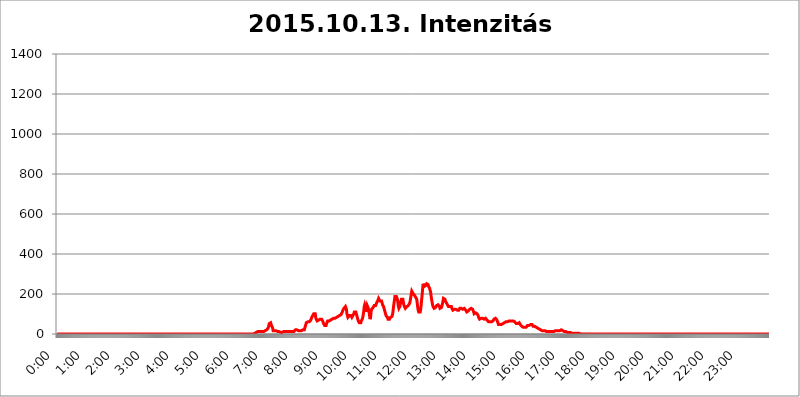
| Category | 2015.10.13. Intenzitás [W/m^2] |
|---|---|
| 0.0 | 0 |
| 0.0006944444444444445 | 0 |
| 0.001388888888888889 | 0 |
| 0.0020833333333333333 | 0 |
| 0.002777777777777778 | 0 |
| 0.003472222222222222 | 0 |
| 0.004166666666666667 | 0 |
| 0.004861111111111111 | 0 |
| 0.005555555555555556 | 0 |
| 0.0062499999999999995 | 0 |
| 0.006944444444444444 | 0 |
| 0.007638888888888889 | 0 |
| 0.008333333333333333 | 0 |
| 0.009027777777777779 | 0 |
| 0.009722222222222222 | 0 |
| 0.010416666666666666 | 0 |
| 0.011111111111111112 | 0 |
| 0.011805555555555555 | 0 |
| 0.012499999999999999 | 0 |
| 0.013194444444444444 | 0 |
| 0.013888888888888888 | 0 |
| 0.014583333333333332 | 0 |
| 0.015277777777777777 | 0 |
| 0.015972222222222224 | 0 |
| 0.016666666666666666 | 0 |
| 0.017361111111111112 | 0 |
| 0.018055555555555557 | 0 |
| 0.01875 | 0 |
| 0.019444444444444445 | 0 |
| 0.02013888888888889 | 0 |
| 0.020833333333333332 | 0 |
| 0.02152777777777778 | 0 |
| 0.022222222222222223 | 0 |
| 0.02291666666666667 | 0 |
| 0.02361111111111111 | 0 |
| 0.024305555555555556 | 0 |
| 0.024999999999999998 | 0 |
| 0.025694444444444447 | 0 |
| 0.02638888888888889 | 0 |
| 0.027083333333333334 | 0 |
| 0.027777777777777776 | 0 |
| 0.02847222222222222 | 0 |
| 0.029166666666666664 | 0 |
| 0.029861111111111113 | 0 |
| 0.030555555555555555 | 0 |
| 0.03125 | 0 |
| 0.03194444444444445 | 0 |
| 0.03263888888888889 | 0 |
| 0.03333333333333333 | 0 |
| 0.034027777777777775 | 0 |
| 0.034722222222222224 | 0 |
| 0.035416666666666666 | 0 |
| 0.036111111111111115 | 0 |
| 0.03680555555555556 | 0 |
| 0.0375 | 0 |
| 0.03819444444444444 | 0 |
| 0.03888888888888889 | 0 |
| 0.03958333333333333 | 0 |
| 0.04027777777777778 | 0 |
| 0.04097222222222222 | 0 |
| 0.041666666666666664 | 0 |
| 0.042361111111111106 | 0 |
| 0.04305555555555556 | 0 |
| 0.043750000000000004 | 0 |
| 0.044444444444444446 | 0 |
| 0.04513888888888889 | 0 |
| 0.04583333333333334 | 0 |
| 0.04652777777777778 | 0 |
| 0.04722222222222222 | 0 |
| 0.04791666666666666 | 0 |
| 0.04861111111111111 | 0 |
| 0.049305555555555554 | 0 |
| 0.049999999999999996 | 0 |
| 0.05069444444444445 | 0 |
| 0.051388888888888894 | 0 |
| 0.052083333333333336 | 0 |
| 0.05277777777777778 | 0 |
| 0.05347222222222222 | 0 |
| 0.05416666666666667 | 0 |
| 0.05486111111111111 | 0 |
| 0.05555555555555555 | 0 |
| 0.05625 | 0 |
| 0.05694444444444444 | 0 |
| 0.057638888888888885 | 0 |
| 0.05833333333333333 | 0 |
| 0.05902777777777778 | 0 |
| 0.059722222222222225 | 0 |
| 0.06041666666666667 | 0 |
| 0.061111111111111116 | 0 |
| 0.06180555555555556 | 0 |
| 0.0625 | 0 |
| 0.06319444444444444 | 0 |
| 0.06388888888888888 | 0 |
| 0.06458333333333334 | 0 |
| 0.06527777777777778 | 0 |
| 0.06597222222222222 | 0 |
| 0.06666666666666667 | 0 |
| 0.06736111111111111 | 0 |
| 0.06805555555555555 | 0 |
| 0.06874999999999999 | 0 |
| 0.06944444444444443 | 0 |
| 0.07013888888888889 | 0 |
| 0.07083333333333333 | 0 |
| 0.07152777777777779 | 0 |
| 0.07222222222222223 | 0 |
| 0.07291666666666667 | 0 |
| 0.07361111111111111 | 0 |
| 0.07430555555555556 | 0 |
| 0.075 | 0 |
| 0.07569444444444444 | 0 |
| 0.0763888888888889 | 0 |
| 0.07708333333333334 | 0 |
| 0.07777777777777778 | 0 |
| 0.07847222222222222 | 0 |
| 0.07916666666666666 | 0 |
| 0.0798611111111111 | 0 |
| 0.08055555555555556 | 0 |
| 0.08125 | 0 |
| 0.08194444444444444 | 0 |
| 0.08263888888888889 | 0 |
| 0.08333333333333333 | 0 |
| 0.08402777777777777 | 0 |
| 0.08472222222222221 | 0 |
| 0.08541666666666665 | 0 |
| 0.08611111111111112 | 0 |
| 0.08680555555555557 | 0 |
| 0.08750000000000001 | 0 |
| 0.08819444444444445 | 0 |
| 0.08888888888888889 | 0 |
| 0.08958333333333333 | 0 |
| 0.09027777777777778 | 0 |
| 0.09097222222222222 | 0 |
| 0.09166666666666667 | 0 |
| 0.09236111111111112 | 0 |
| 0.09305555555555556 | 0 |
| 0.09375 | 0 |
| 0.09444444444444444 | 0 |
| 0.09513888888888888 | 0 |
| 0.09583333333333333 | 0 |
| 0.09652777777777777 | 0 |
| 0.09722222222222222 | 0 |
| 0.09791666666666667 | 0 |
| 0.09861111111111111 | 0 |
| 0.09930555555555555 | 0 |
| 0.09999999999999999 | 0 |
| 0.10069444444444443 | 0 |
| 0.1013888888888889 | 0 |
| 0.10208333333333335 | 0 |
| 0.10277777777777779 | 0 |
| 0.10347222222222223 | 0 |
| 0.10416666666666667 | 0 |
| 0.10486111111111111 | 0 |
| 0.10555555555555556 | 0 |
| 0.10625 | 0 |
| 0.10694444444444444 | 0 |
| 0.1076388888888889 | 0 |
| 0.10833333333333334 | 0 |
| 0.10902777777777778 | 0 |
| 0.10972222222222222 | 0 |
| 0.1111111111111111 | 0 |
| 0.11180555555555556 | 0 |
| 0.11180555555555556 | 0 |
| 0.1125 | 0 |
| 0.11319444444444444 | 0 |
| 0.11388888888888889 | 0 |
| 0.11458333333333333 | 0 |
| 0.11527777777777777 | 0 |
| 0.11597222222222221 | 0 |
| 0.11666666666666665 | 0 |
| 0.1173611111111111 | 0 |
| 0.11805555555555557 | 0 |
| 0.11944444444444445 | 0 |
| 0.12013888888888889 | 0 |
| 0.12083333333333333 | 0 |
| 0.12152777777777778 | 0 |
| 0.12222222222222223 | 0 |
| 0.12291666666666667 | 0 |
| 0.12291666666666667 | 0 |
| 0.12361111111111112 | 0 |
| 0.12430555555555556 | 0 |
| 0.125 | 0 |
| 0.12569444444444444 | 0 |
| 0.12638888888888888 | 0 |
| 0.12708333333333333 | 0 |
| 0.16875 | 0 |
| 0.12847222222222224 | 0 |
| 0.12916666666666668 | 0 |
| 0.12986111111111112 | 0 |
| 0.13055555555555556 | 0 |
| 0.13125 | 0 |
| 0.13194444444444445 | 0 |
| 0.1326388888888889 | 0 |
| 0.13333333333333333 | 0 |
| 0.13402777777777777 | 0 |
| 0.13402777777777777 | 0 |
| 0.13472222222222222 | 0 |
| 0.13541666666666666 | 0 |
| 0.1361111111111111 | 0 |
| 0.13749999999999998 | 0 |
| 0.13819444444444443 | 0 |
| 0.1388888888888889 | 0 |
| 0.13958333333333334 | 0 |
| 0.14027777777777778 | 0 |
| 0.14097222222222222 | 0 |
| 0.14166666666666666 | 0 |
| 0.1423611111111111 | 0 |
| 0.14305555555555557 | 0 |
| 0.14375000000000002 | 0 |
| 0.14444444444444446 | 0 |
| 0.1451388888888889 | 0 |
| 0.1451388888888889 | 0 |
| 0.14652777777777778 | 0 |
| 0.14722222222222223 | 0 |
| 0.14791666666666667 | 0 |
| 0.1486111111111111 | 0 |
| 0.14930555555555555 | 0 |
| 0.15 | 0 |
| 0.15069444444444444 | 0 |
| 0.15138888888888888 | 0 |
| 0.15208333333333332 | 0 |
| 0.15277777777777776 | 0 |
| 0.15347222222222223 | 0 |
| 0.15416666666666667 | 0 |
| 0.15486111111111112 | 0 |
| 0.15555555555555556 | 0 |
| 0.15625 | 0 |
| 0.15694444444444444 | 0 |
| 0.15763888888888888 | 0 |
| 0.15833333333333333 | 0 |
| 0.15902777777777777 | 0 |
| 0.15972222222222224 | 0 |
| 0.16041666666666668 | 0 |
| 0.16111111111111112 | 0 |
| 0.16180555555555556 | 0 |
| 0.1625 | 0 |
| 0.16319444444444445 | 0 |
| 0.1638888888888889 | 0 |
| 0.16458333333333333 | 0 |
| 0.16527777777777777 | 0 |
| 0.16597222222222222 | 0 |
| 0.16666666666666666 | 0 |
| 0.1673611111111111 | 0 |
| 0.16805555555555554 | 0 |
| 0.16874999999999998 | 0 |
| 0.16944444444444443 | 0 |
| 0.17013888888888887 | 0 |
| 0.1708333333333333 | 0 |
| 0.17152777777777775 | 0 |
| 0.17222222222222225 | 0 |
| 0.1729166666666667 | 0 |
| 0.17361111111111113 | 0 |
| 0.17430555555555557 | 0 |
| 0.17500000000000002 | 0 |
| 0.17569444444444446 | 0 |
| 0.1763888888888889 | 0 |
| 0.17708333333333334 | 0 |
| 0.17777777777777778 | 0 |
| 0.17847222222222223 | 0 |
| 0.17916666666666667 | 0 |
| 0.1798611111111111 | 0 |
| 0.18055555555555555 | 0 |
| 0.18125 | 0 |
| 0.18194444444444444 | 0 |
| 0.1826388888888889 | 0 |
| 0.18333333333333335 | 0 |
| 0.1840277777777778 | 0 |
| 0.18472222222222223 | 0 |
| 0.18541666666666667 | 0 |
| 0.18611111111111112 | 0 |
| 0.18680555555555556 | 0 |
| 0.1875 | 0 |
| 0.18819444444444444 | 0 |
| 0.18888888888888888 | 0 |
| 0.18958333333333333 | 0 |
| 0.19027777777777777 | 0 |
| 0.1909722222222222 | 0 |
| 0.19166666666666665 | 0 |
| 0.19236111111111112 | 0 |
| 0.19305555555555554 | 0 |
| 0.19375 | 0 |
| 0.19444444444444445 | 0 |
| 0.1951388888888889 | 0 |
| 0.19583333333333333 | 0 |
| 0.19652777777777777 | 0 |
| 0.19722222222222222 | 0 |
| 0.19791666666666666 | 0 |
| 0.1986111111111111 | 0 |
| 0.19930555555555554 | 0 |
| 0.19999999999999998 | 0 |
| 0.20069444444444443 | 0 |
| 0.20138888888888887 | 0 |
| 0.2020833333333333 | 0 |
| 0.2027777777777778 | 0 |
| 0.2034722222222222 | 0 |
| 0.2041666666666667 | 0 |
| 0.20486111111111113 | 0 |
| 0.20555555555555557 | 0 |
| 0.20625000000000002 | 0 |
| 0.20694444444444446 | 0 |
| 0.2076388888888889 | 0 |
| 0.20833333333333334 | 0 |
| 0.20902777777777778 | 0 |
| 0.20972222222222223 | 0 |
| 0.21041666666666667 | 0 |
| 0.2111111111111111 | 0 |
| 0.21180555555555555 | 0 |
| 0.2125 | 0 |
| 0.21319444444444444 | 0 |
| 0.2138888888888889 | 0 |
| 0.21458333333333335 | 0 |
| 0.2152777777777778 | 0 |
| 0.21597222222222223 | 0 |
| 0.21666666666666667 | 0 |
| 0.21736111111111112 | 0 |
| 0.21805555555555556 | 0 |
| 0.21875 | 0 |
| 0.21944444444444444 | 0 |
| 0.22013888888888888 | 0 |
| 0.22083333333333333 | 0 |
| 0.22152777777777777 | 0 |
| 0.2222222222222222 | 0 |
| 0.22291666666666665 | 0 |
| 0.2236111111111111 | 0 |
| 0.22430555555555556 | 0 |
| 0.225 | 0 |
| 0.22569444444444445 | 0 |
| 0.2263888888888889 | 0 |
| 0.22708333333333333 | 0 |
| 0.22777777777777777 | 0 |
| 0.22847222222222222 | 0 |
| 0.22916666666666666 | 0 |
| 0.2298611111111111 | 0 |
| 0.23055555555555554 | 0 |
| 0.23124999999999998 | 0 |
| 0.23194444444444443 | 0 |
| 0.23263888888888887 | 0 |
| 0.2333333333333333 | 0 |
| 0.2340277777777778 | 0 |
| 0.2347222222222222 | 0 |
| 0.2354166666666667 | 0 |
| 0.23611111111111113 | 0 |
| 0.23680555555555557 | 0 |
| 0.23750000000000002 | 0 |
| 0.23819444444444446 | 0 |
| 0.2388888888888889 | 0 |
| 0.23958333333333334 | 0 |
| 0.24027777777777778 | 0 |
| 0.24097222222222223 | 0 |
| 0.24166666666666667 | 0 |
| 0.2423611111111111 | 0 |
| 0.24305555555555555 | 0 |
| 0.24375 | 0 |
| 0.24444444444444446 | 0 |
| 0.24513888888888888 | 0 |
| 0.24583333333333335 | 0 |
| 0.2465277777777778 | 0 |
| 0.24722222222222223 | 0 |
| 0.24791666666666667 | 0 |
| 0.24861111111111112 | 0 |
| 0.24930555555555556 | 0 |
| 0.25 | 0 |
| 0.25069444444444444 | 0 |
| 0.2513888888888889 | 0 |
| 0.2520833333333333 | 0 |
| 0.25277777777777777 | 0 |
| 0.2534722222222222 | 0 |
| 0.25416666666666665 | 0 |
| 0.2548611111111111 | 0 |
| 0.2555555555555556 | 0 |
| 0.25625000000000003 | 0 |
| 0.2569444444444445 | 0 |
| 0.2576388888888889 | 0 |
| 0.25833333333333336 | 0 |
| 0.2590277777777778 | 0 |
| 0.25972222222222224 | 0 |
| 0.2604166666666667 | 0 |
| 0.2611111111111111 | 0 |
| 0.26180555555555557 | 0 |
| 0.2625 | 0 |
| 0.26319444444444445 | 0 |
| 0.2638888888888889 | 0 |
| 0.26458333333333334 | 0 |
| 0.2652777777777778 | 0 |
| 0.2659722222222222 | 0 |
| 0.26666666666666666 | 0 |
| 0.2673611111111111 | 0 |
| 0.26805555555555555 | 0 |
| 0.26875 | 0 |
| 0.26944444444444443 | 0 |
| 0.2701388888888889 | 0 |
| 0.2708333333333333 | 0 |
| 0.27152777777777776 | 0 |
| 0.2722222222222222 | 0 |
| 0.27291666666666664 | 0 |
| 0.2736111111111111 | 0 |
| 0.2743055555555555 | 0 |
| 0.27499999999999997 | 0 |
| 0.27569444444444446 | 0 |
| 0.27638888888888885 | 3.525 |
| 0.27708333333333335 | 3.525 |
| 0.2777777777777778 | 3.525 |
| 0.27847222222222223 | 7.887 |
| 0.2791666666666667 | 7.887 |
| 0.2798611111111111 | 7.887 |
| 0.28055555555555556 | 7.887 |
| 0.28125 | 12.257 |
| 0.28194444444444444 | 12.257 |
| 0.2826388888888889 | 12.257 |
| 0.2833333333333333 | 12.257 |
| 0.28402777777777777 | 12.257 |
| 0.2847222222222222 | 12.257 |
| 0.28541666666666665 | 12.257 |
| 0.28611111111111115 | 12.257 |
| 0.28680555555555554 | 12.257 |
| 0.28750000000000003 | 12.257 |
| 0.2881944444444445 | 12.257 |
| 0.2888888888888889 | 12.257 |
| 0.28958333333333336 | 12.257 |
| 0.2902777777777778 | 16.636 |
| 0.29097222222222224 | 16.636 |
| 0.2916666666666667 | 16.636 |
| 0.2923611111111111 | 21.024 |
| 0.29305555555555557 | 21.024 |
| 0.29375 | 21.024 |
| 0.29444444444444445 | 25.419 |
| 0.2951388888888889 | 25.419 |
| 0.29583333333333334 | 29.823 |
| 0.2965277777777778 | 38.653 |
| 0.2972222222222222 | 51.951 |
| 0.29791666666666666 | 56.398 |
| 0.2986111111111111 | 56.398 |
| 0.29930555555555555 | 56.398 |
| 0.3 | 47.511 |
| 0.30069444444444443 | 47.511 |
| 0.3013888888888889 | 47.511 |
| 0.3020833333333333 | 29.823 |
| 0.30277777777777776 | 16.636 |
| 0.3034722222222222 | 21.024 |
| 0.30416666666666664 | 16.636 |
| 0.3048611111111111 | 16.636 |
| 0.3055555555555555 | 12.257 |
| 0.30624999999999997 | 12.257 |
| 0.3069444444444444 | 16.636 |
| 0.3076388888888889 | 16.636 |
| 0.30833333333333335 | 16.636 |
| 0.3090277777777778 | 12.257 |
| 0.30972222222222223 | 12.257 |
| 0.3104166666666667 | 12.257 |
| 0.3111111111111111 | 12.257 |
| 0.31180555555555556 | 7.887 |
| 0.3125 | 12.257 |
| 0.31319444444444444 | 7.887 |
| 0.3138888888888889 | 7.887 |
| 0.3145833333333333 | 7.887 |
| 0.31527777777777777 | 7.887 |
| 0.3159722222222222 | 7.887 |
| 0.31666666666666665 | 7.887 |
| 0.31736111111111115 | 12.257 |
| 0.31805555555555554 | 12.257 |
| 0.31875000000000003 | 12.257 |
| 0.3194444444444445 | 12.257 |
| 0.3201388888888889 | 12.257 |
| 0.32083333333333336 | 12.257 |
| 0.3215277777777778 | 12.257 |
| 0.32222222222222224 | 12.257 |
| 0.3229166666666667 | 12.257 |
| 0.3236111111111111 | 12.257 |
| 0.32430555555555557 | 12.257 |
| 0.325 | 12.257 |
| 0.32569444444444445 | 12.257 |
| 0.3263888888888889 | 12.257 |
| 0.32708333333333334 | 12.257 |
| 0.3277777777777778 | 12.257 |
| 0.3284722222222222 | 12.257 |
| 0.32916666666666666 | 12.257 |
| 0.3298611111111111 | 12.257 |
| 0.33055555555555555 | 12.257 |
| 0.33125 | 12.257 |
| 0.33194444444444443 | 12.257 |
| 0.3326388888888889 | 12.257 |
| 0.3333333333333333 | 16.636 |
| 0.3340277777777778 | 21.024 |
| 0.3347222222222222 | 16.636 |
| 0.3354166666666667 | 21.024 |
| 0.3361111111111111 | 21.024 |
| 0.3368055555555556 | 21.024 |
| 0.33749999999999997 | 21.024 |
| 0.33819444444444446 | 16.636 |
| 0.33888888888888885 | 16.636 |
| 0.33958333333333335 | 16.636 |
| 0.34027777777777773 | 16.636 |
| 0.34097222222222223 | 16.636 |
| 0.3416666666666666 | 16.636 |
| 0.3423611111111111 | 16.636 |
| 0.3430555555555555 | 16.636 |
| 0.34375 | 21.024 |
| 0.3444444444444445 | 21.024 |
| 0.3451388888888889 | 21.024 |
| 0.3458333333333334 | 21.024 |
| 0.34652777777777777 | 21.024 |
| 0.34722222222222227 | 25.419 |
| 0.34791666666666665 | 38.653 |
| 0.34861111111111115 | 47.511 |
| 0.34930555555555554 | 56.398 |
| 0.35000000000000003 | 60.85 |
| 0.3506944444444444 | 60.85 |
| 0.3513888888888889 | 60.85 |
| 0.3520833333333333 | 65.31 |
| 0.3527777777777778 | 65.31 |
| 0.3534722222222222 | 60.85 |
| 0.3541666666666667 | 65.31 |
| 0.3548611111111111 | 65.31 |
| 0.35555555555555557 | 69.775 |
| 0.35625 | 74.246 |
| 0.35694444444444445 | 83.205 |
| 0.3576388888888889 | 87.692 |
| 0.35833333333333334 | 92.184 |
| 0.3590277777777778 | 96.682 |
| 0.3597222222222222 | 101.184 |
| 0.36041666666666666 | 105.69 |
| 0.3611111111111111 | 105.69 |
| 0.36180555555555555 | 101.184 |
| 0.3625 | 83.205 |
| 0.36319444444444443 | 74.246 |
| 0.3638888888888889 | 69.775 |
| 0.3645833333333333 | 65.31 |
| 0.3652777777777778 | 69.775 |
| 0.3659722222222222 | 69.775 |
| 0.3666666666666667 | 69.775 |
| 0.3673611111111111 | 74.246 |
| 0.3680555555555556 | 69.775 |
| 0.36874999999999997 | 74.246 |
| 0.36944444444444446 | 74.246 |
| 0.37013888888888885 | 74.246 |
| 0.37083333333333335 | 74.246 |
| 0.37152777777777773 | 69.775 |
| 0.37222222222222223 | 65.31 |
| 0.3729166666666666 | 60.85 |
| 0.3736111111111111 | 51.951 |
| 0.3743055555555555 | 47.511 |
| 0.375 | 43.079 |
| 0.3756944444444445 | 43.079 |
| 0.3763888888888889 | 43.079 |
| 0.3770833333333334 | 43.079 |
| 0.37777777777777777 | 51.951 |
| 0.37847222222222227 | 56.398 |
| 0.37916666666666665 | 65.31 |
| 0.37986111111111115 | 65.31 |
| 0.38055555555555554 | 65.31 |
| 0.38125000000000003 | 65.31 |
| 0.3819444444444444 | 69.775 |
| 0.3826388888888889 | 69.775 |
| 0.3833333333333333 | 69.775 |
| 0.3840277777777778 | 69.775 |
| 0.3847222222222222 | 69.775 |
| 0.3854166666666667 | 74.246 |
| 0.3861111111111111 | 74.246 |
| 0.38680555555555557 | 78.722 |
| 0.3875 | 78.722 |
| 0.38819444444444445 | 78.722 |
| 0.3888888888888889 | 78.722 |
| 0.38958333333333334 | 78.722 |
| 0.3902777777777778 | 78.722 |
| 0.3909722222222222 | 78.722 |
| 0.39166666666666666 | 83.205 |
| 0.3923611111111111 | 87.692 |
| 0.39305555555555555 | 87.692 |
| 0.39375 | 87.692 |
| 0.39444444444444443 | 87.692 |
| 0.3951388888888889 | 92.184 |
| 0.3958333333333333 | 92.184 |
| 0.3965277777777778 | 92.184 |
| 0.3972222222222222 | 96.682 |
| 0.3979166666666667 | 96.682 |
| 0.3986111111111111 | 101.184 |
| 0.3993055555555556 | 105.69 |
| 0.39999999999999997 | 110.201 |
| 0.40069444444444446 | 119.235 |
| 0.40138888888888885 | 123.758 |
| 0.40208333333333335 | 128.284 |
| 0.40277777777777773 | 128.284 |
| 0.40347222222222223 | 132.814 |
| 0.4041666666666666 | 137.347 |
| 0.4048611111111111 | 132.814 |
| 0.4055555555555555 | 123.758 |
| 0.40625 | 101.184 |
| 0.4069444444444445 | 92.184 |
| 0.4076388888888889 | 83.205 |
| 0.4083333333333334 | 83.205 |
| 0.40902777777777777 | 83.205 |
| 0.40972222222222227 | 92.184 |
| 0.41041666666666665 | 96.682 |
| 0.41111111111111115 | 96.682 |
| 0.41180555555555554 | 92.184 |
| 0.41250000000000003 | 87.692 |
| 0.4131944444444444 | 83.205 |
| 0.4138888888888889 | 87.692 |
| 0.4145833333333333 | 92.184 |
| 0.4152777777777778 | 96.682 |
| 0.4159722222222222 | 101.184 |
| 0.4166666666666667 | 110.201 |
| 0.4173611111111111 | 114.716 |
| 0.41805555555555557 | 114.716 |
| 0.41875 | 110.201 |
| 0.41944444444444445 | 101.184 |
| 0.4201388888888889 | 92.184 |
| 0.42083333333333334 | 83.205 |
| 0.4215277777777778 | 74.246 |
| 0.4222222222222222 | 65.31 |
| 0.42291666666666666 | 60.85 |
| 0.4236111111111111 | 56.398 |
| 0.42430555555555555 | 56.398 |
| 0.425 | 56.398 |
| 0.42569444444444443 | 56.398 |
| 0.4263888888888889 | 65.31 |
| 0.4270833333333333 | 69.775 |
| 0.4277777777777778 | 74.246 |
| 0.4284722222222222 | 83.205 |
| 0.4291666666666667 | 96.682 |
| 0.4298611111111111 | 114.716 |
| 0.4305555555555556 | 137.347 |
| 0.43124999999999997 | 146.423 |
| 0.43194444444444446 | 137.347 |
| 0.43263888888888885 | 119.235 |
| 0.43333333333333335 | 110.201 |
| 0.43402777777777773 | 114.716 |
| 0.43472222222222223 | 141.884 |
| 0.4354166666666666 | 146.423 |
| 0.4361111111111111 | 141.884 |
| 0.4368055555555555 | 123.758 |
| 0.4375 | 105.69 |
| 0.4381944444444445 | 87.692 |
| 0.4388888888888889 | 74.246 |
| 0.4395833333333334 | 87.692 |
| 0.44027777777777777 | 114.716 |
| 0.44097222222222227 | 123.758 |
| 0.44166666666666665 | 123.758 |
| 0.44236111111111115 | 128.284 |
| 0.44305555555555554 | 132.814 |
| 0.44375000000000003 | 137.347 |
| 0.4444444444444444 | 141.884 |
| 0.4451388888888889 | 141.884 |
| 0.4458333333333333 | 137.347 |
| 0.4465277777777778 | 141.884 |
| 0.4472222222222222 | 146.423 |
| 0.4479166666666667 | 155.509 |
| 0.4486111111111111 | 155.509 |
| 0.44930555555555557 | 164.605 |
| 0.45 | 169.156 |
| 0.45069444444444445 | 178.264 |
| 0.4513888888888889 | 182.82 |
| 0.45208333333333334 | 173.709 |
| 0.4527777777777778 | 164.605 |
| 0.4534722222222222 | 164.605 |
| 0.45416666666666666 | 160.056 |
| 0.4548611111111111 | 164.605 |
| 0.45555555555555555 | 160.056 |
| 0.45625 | 146.423 |
| 0.45694444444444443 | 141.884 |
| 0.4576388888888889 | 137.347 |
| 0.4583333333333333 | 132.814 |
| 0.4590277777777778 | 119.235 |
| 0.4597222222222222 | 110.201 |
| 0.4604166666666667 | 101.184 |
| 0.4611111111111111 | 92.184 |
| 0.4618055555555556 | 92.184 |
| 0.46249999999999997 | 92.184 |
| 0.46319444444444446 | 83.205 |
| 0.46388888888888885 | 74.246 |
| 0.46458333333333335 | 69.775 |
| 0.46527777777777773 | 69.775 |
| 0.46597222222222223 | 74.246 |
| 0.4666666666666666 | 78.722 |
| 0.4673611111111111 | 83.205 |
| 0.4680555555555555 | 87.692 |
| 0.46875 | 87.692 |
| 0.4694444444444445 | 87.692 |
| 0.4701388888888889 | 96.682 |
| 0.4708333333333334 | 110.201 |
| 0.47152777777777777 | 132.814 |
| 0.47222222222222227 | 150.964 |
| 0.47291666666666665 | 169.156 |
| 0.47361111111111115 | 187.378 |
| 0.47430555555555554 | 191.937 |
| 0.47500000000000003 | 191.937 |
| 0.4756944444444444 | 187.378 |
| 0.4763888888888889 | 182.82 |
| 0.4770833333333333 | 173.709 |
| 0.4777777777777778 | 155.509 |
| 0.4784722222222222 | 137.347 |
| 0.4791666666666667 | 128.284 |
| 0.4798611111111111 | 128.284 |
| 0.48055555555555557 | 137.347 |
| 0.48125 | 150.964 |
| 0.48194444444444445 | 164.605 |
| 0.4826388888888889 | 173.709 |
| 0.48333333333333334 | 178.264 |
| 0.4840277777777778 | 178.264 |
| 0.4847222222222222 | 173.709 |
| 0.48541666666666666 | 160.056 |
| 0.4861111111111111 | 146.423 |
| 0.48680555555555555 | 137.347 |
| 0.4875 | 132.814 |
| 0.48819444444444443 | 128.284 |
| 0.4888888888888889 | 128.284 |
| 0.4895833333333333 | 132.814 |
| 0.4902777777777778 | 137.347 |
| 0.4909722222222222 | 141.884 |
| 0.4916666666666667 | 141.884 |
| 0.4923611111111111 | 141.884 |
| 0.4930555555555556 | 146.423 |
| 0.49374999999999997 | 146.423 |
| 0.49444444444444446 | 155.509 |
| 0.49513888888888885 | 169.156 |
| 0.49583333333333335 | 182.82 |
| 0.49652777777777773 | 201.058 |
| 0.49722222222222223 | 214.746 |
| 0.4979166666666666 | 219.309 |
| 0.4986111111111111 | 214.746 |
| 0.4993055555555555 | 201.058 |
| 0.5 | 196.497 |
| 0.5006944444444444 | 196.497 |
| 0.5013888888888889 | 191.937 |
| 0.5020833333333333 | 187.378 |
| 0.5027777777777778 | 182.82 |
| 0.5034722222222222 | 182.82 |
| 0.5041666666666667 | 173.709 |
| 0.5048611111111111 | 155.509 |
| 0.5055555555555555 | 132.814 |
| 0.50625 | 119.235 |
| 0.5069444444444444 | 110.201 |
| 0.5076388888888889 | 105.69 |
| 0.5083333333333333 | 105.69 |
| 0.5090277777777777 | 110.201 |
| 0.5097222222222222 | 123.758 |
| 0.5104166666666666 | 146.423 |
| 0.5111111111111112 | 173.709 |
| 0.5118055555555555 | 196.497 |
| 0.5125000000000001 | 228.436 |
| 0.5131944444444444 | 251.251 |
| 0.513888888888889 | 251.251 |
| 0.5145833333333333 | 237.564 |
| 0.5152777777777778 | 237.564 |
| 0.5159722222222222 | 242.127 |
| 0.5166666666666667 | 242.127 |
| 0.517361111111111 | 246.689 |
| 0.5180555555555556 | 251.251 |
| 0.5187499999999999 | 251.251 |
| 0.5194444444444445 | 251.251 |
| 0.5201388888888888 | 246.689 |
| 0.5208333333333334 | 237.564 |
| 0.5215277777777778 | 233 |
| 0.5222222222222223 | 228.436 |
| 0.5229166666666667 | 219.309 |
| 0.5236111111111111 | 210.182 |
| 0.5243055555555556 | 191.937 |
| 0.525 | 173.709 |
| 0.5256944444444445 | 160.056 |
| 0.5263888888888889 | 146.423 |
| 0.5270833333333333 | 137.347 |
| 0.5277777777777778 | 132.814 |
| 0.5284722222222222 | 128.284 |
| 0.5291666666666667 | 128.284 |
| 0.5298611111111111 | 128.284 |
| 0.5305555555555556 | 132.814 |
| 0.53125 | 137.347 |
| 0.5319444444444444 | 141.884 |
| 0.5326388888888889 | 141.884 |
| 0.5333333333333333 | 146.423 |
| 0.5340277777777778 | 146.423 |
| 0.5347222222222222 | 141.884 |
| 0.5354166666666667 | 141.884 |
| 0.5361111111111111 | 137.347 |
| 0.5368055555555555 | 128.284 |
| 0.5375 | 128.284 |
| 0.5381944444444444 | 128.284 |
| 0.5388888888888889 | 132.814 |
| 0.5395833333333333 | 137.347 |
| 0.5402777777777777 | 150.964 |
| 0.5409722222222222 | 164.605 |
| 0.5416666666666666 | 178.264 |
| 0.5423611111111112 | 182.82 |
| 0.5430555555555555 | 182.82 |
| 0.5437500000000001 | 173.709 |
| 0.5444444444444444 | 164.605 |
| 0.545138888888889 | 160.056 |
| 0.5458333333333333 | 155.509 |
| 0.5465277777777778 | 150.964 |
| 0.5472222222222222 | 146.423 |
| 0.5479166666666667 | 141.884 |
| 0.548611111111111 | 137.347 |
| 0.5493055555555556 | 132.814 |
| 0.5499999999999999 | 137.347 |
| 0.5506944444444445 | 137.347 |
| 0.5513888888888888 | 141.884 |
| 0.5520833333333334 | 141.884 |
| 0.5527777777777778 | 137.347 |
| 0.5534722222222223 | 128.284 |
| 0.5541666666666667 | 123.758 |
| 0.5548611111111111 | 119.235 |
| 0.5555555555555556 | 119.235 |
| 0.55625 | 119.235 |
| 0.5569444444444445 | 123.758 |
| 0.5576388888888889 | 123.758 |
| 0.5583333333333333 | 123.758 |
| 0.5590277777777778 | 123.758 |
| 0.5597222222222222 | 123.758 |
| 0.5604166666666667 | 119.235 |
| 0.5611111111111111 | 119.235 |
| 0.5618055555555556 | 119.235 |
| 0.5625 | 119.235 |
| 0.5631944444444444 | 119.235 |
| 0.5638888888888889 | 123.758 |
| 0.5645833333333333 | 128.284 |
| 0.5652777777777778 | 128.284 |
| 0.5659722222222222 | 128.284 |
| 0.5666666666666667 | 128.284 |
| 0.5673611111111111 | 128.284 |
| 0.5680555555555555 | 128.284 |
| 0.56875 | 123.758 |
| 0.5694444444444444 | 123.758 |
| 0.5701388888888889 | 128.284 |
| 0.5708333333333333 | 128.284 |
| 0.5715277777777777 | 128.284 |
| 0.5722222222222222 | 123.758 |
| 0.5729166666666666 | 119.235 |
| 0.5736111111111112 | 114.716 |
| 0.5743055555555555 | 110.201 |
| 0.5750000000000001 | 110.201 |
| 0.5756944444444444 | 110.201 |
| 0.576388888888889 | 114.716 |
| 0.5770833333333333 | 114.716 |
| 0.5777777777777778 | 119.235 |
| 0.5784722222222222 | 123.758 |
| 0.5791666666666667 | 128.284 |
| 0.579861111111111 | 128.284 |
| 0.5805555555555556 | 128.284 |
| 0.5812499999999999 | 128.284 |
| 0.5819444444444445 | 128.284 |
| 0.5826388888888888 | 123.758 |
| 0.5833333333333334 | 119.235 |
| 0.5840277777777778 | 110.201 |
| 0.5847222222222223 | 101.184 |
| 0.5854166666666667 | 96.682 |
| 0.5861111111111111 | 101.184 |
| 0.5868055555555556 | 105.69 |
| 0.5875 | 105.69 |
| 0.5881944444444445 | 105.69 |
| 0.5888888888888889 | 101.184 |
| 0.5895833333333333 | 96.682 |
| 0.5902777777777778 | 92.184 |
| 0.5909722222222222 | 83.205 |
| 0.5916666666666667 | 78.722 |
| 0.5923611111111111 | 74.246 |
| 0.5930555555555556 | 74.246 |
| 0.59375 | 78.722 |
| 0.5944444444444444 | 78.722 |
| 0.5951388888888889 | 83.205 |
| 0.5958333333333333 | 78.722 |
| 0.5965277777777778 | 78.722 |
| 0.5972222222222222 | 74.246 |
| 0.5979166666666667 | 74.246 |
| 0.5986111111111111 | 74.246 |
| 0.5993055555555555 | 78.722 |
| 0.6 | 78.722 |
| 0.6006944444444444 | 78.722 |
| 0.6013888888888889 | 78.722 |
| 0.6020833333333333 | 74.246 |
| 0.6027777777777777 | 69.775 |
| 0.6034722222222222 | 65.31 |
| 0.6041666666666666 | 65.31 |
| 0.6048611111111112 | 60.85 |
| 0.6055555555555555 | 60.85 |
| 0.6062500000000001 | 56.398 |
| 0.6069444444444444 | 60.85 |
| 0.607638888888889 | 65.31 |
| 0.6083333333333333 | 60.85 |
| 0.6090277777777778 | 60.85 |
| 0.6097222222222222 | 60.85 |
| 0.6104166666666667 | 65.31 |
| 0.611111111111111 | 65.31 |
| 0.6118055555555556 | 69.775 |
| 0.6124999999999999 | 74.246 |
| 0.6131944444444445 | 74.246 |
| 0.6138888888888888 | 78.722 |
| 0.6145833333333334 | 78.722 |
| 0.6152777777777778 | 78.722 |
| 0.6159722222222223 | 74.246 |
| 0.6166666666666667 | 69.775 |
| 0.6173611111111111 | 65.31 |
| 0.6180555555555556 | 56.398 |
| 0.61875 | 47.511 |
| 0.6194444444444445 | 47.511 |
| 0.6201388888888889 | 47.511 |
| 0.6208333333333333 | 47.511 |
| 0.6215277777777778 | 47.511 |
| 0.6222222222222222 | 47.511 |
| 0.6229166666666667 | 47.511 |
| 0.6236111111111111 | 47.511 |
| 0.6243055555555556 | 51.951 |
| 0.625 | 51.951 |
| 0.6256944444444444 | 56.398 |
| 0.6263888888888889 | 56.398 |
| 0.6270833333333333 | 56.398 |
| 0.6277777777777778 | 56.398 |
| 0.6284722222222222 | 60.85 |
| 0.6291666666666667 | 60.85 |
| 0.6298611111111111 | 60.85 |
| 0.6305555555555555 | 60.85 |
| 0.63125 | 60.85 |
| 0.6319444444444444 | 60.85 |
| 0.6326388888888889 | 60.85 |
| 0.6333333333333333 | 65.31 |
| 0.6340277777777777 | 65.31 |
| 0.6347222222222222 | 65.31 |
| 0.6354166666666666 | 65.31 |
| 0.6361111111111112 | 60.85 |
| 0.6368055555555555 | 60.85 |
| 0.6375000000000001 | 65.31 |
| 0.6381944444444444 | 65.31 |
| 0.638888888888889 | 65.31 |
| 0.6395833333333333 | 65.31 |
| 0.6402777777777778 | 65.31 |
| 0.6409722222222222 | 65.31 |
| 0.6416666666666667 | 60.85 |
| 0.642361111111111 | 56.398 |
| 0.6430555555555556 | 56.398 |
| 0.6437499999999999 | 51.951 |
| 0.6444444444444445 | 51.951 |
| 0.6451388888888888 | 51.951 |
| 0.6458333333333334 | 51.951 |
| 0.6465277777777778 | 56.398 |
| 0.6472222222222223 | 56.398 |
| 0.6479166666666667 | 56.398 |
| 0.6486111111111111 | 56.398 |
| 0.6493055555555556 | 47.511 |
| 0.65 | 47.511 |
| 0.6506944444444445 | 43.079 |
| 0.6513888888888889 | 38.653 |
| 0.6520833333333333 | 38.653 |
| 0.6527777777777778 | 38.653 |
| 0.6534722222222222 | 34.234 |
| 0.6541666666666667 | 34.234 |
| 0.6548611111111111 | 34.234 |
| 0.6555555555555556 | 34.234 |
| 0.65625 | 34.234 |
| 0.6569444444444444 | 34.234 |
| 0.6576388888888889 | 34.234 |
| 0.6583333333333333 | 38.653 |
| 0.6590277777777778 | 38.653 |
| 0.6597222222222222 | 43.079 |
| 0.6604166666666667 | 43.079 |
| 0.6611111111111111 | 38.653 |
| 0.6618055555555555 | 43.079 |
| 0.6625 | 43.079 |
| 0.6631944444444444 | 43.079 |
| 0.6638888888888889 | 47.511 |
| 0.6645833333333333 | 47.511 |
| 0.6652777777777777 | 47.511 |
| 0.6659722222222222 | 47.511 |
| 0.6666666666666666 | 43.079 |
| 0.6673611111111111 | 38.653 |
| 0.6680555555555556 | 38.653 |
| 0.6687500000000001 | 34.234 |
| 0.6694444444444444 | 38.653 |
| 0.6701388888888888 | 38.653 |
| 0.6708333333333334 | 38.653 |
| 0.6715277777777778 | 34.234 |
| 0.6722222222222222 | 34.234 |
| 0.6729166666666666 | 34.234 |
| 0.6736111111111112 | 29.823 |
| 0.6743055555555556 | 29.823 |
| 0.6749999999999999 | 25.419 |
| 0.6756944444444444 | 25.419 |
| 0.6763888888888889 | 21.024 |
| 0.6770833333333334 | 21.024 |
| 0.6777777777777777 | 21.024 |
| 0.6784722222222223 | 21.024 |
| 0.6791666666666667 | 16.636 |
| 0.6798611111111111 | 16.636 |
| 0.6805555555555555 | 16.636 |
| 0.68125 | 16.636 |
| 0.6819444444444445 | 16.636 |
| 0.6826388888888889 | 16.636 |
| 0.6833333333333332 | 16.636 |
| 0.6840277777777778 | 16.636 |
| 0.6847222222222222 | 16.636 |
| 0.6854166666666667 | 12.257 |
| 0.686111111111111 | 12.257 |
| 0.6868055555555556 | 12.257 |
| 0.6875 | 12.257 |
| 0.6881944444444444 | 12.257 |
| 0.688888888888889 | 12.257 |
| 0.6895833333333333 | 12.257 |
| 0.6902777777777778 | 12.257 |
| 0.6909722222222222 | 12.257 |
| 0.6916666666666668 | 12.257 |
| 0.6923611111111111 | 12.257 |
| 0.6930555555555555 | 12.257 |
| 0.69375 | 12.257 |
| 0.6944444444444445 | 12.257 |
| 0.6951388888888889 | 12.257 |
| 0.6958333333333333 | 12.257 |
| 0.6965277777777777 | 12.257 |
| 0.6972222222222223 | 16.636 |
| 0.6979166666666666 | 16.636 |
| 0.6986111111111111 | 16.636 |
| 0.6993055555555556 | 16.636 |
| 0.7000000000000001 | 12.257 |
| 0.7006944444444444 | 16.636 |
| 0.7013888888888888 | 16.636 |
| 0.7020833333333334 | 16.636 |
| 0.7027777777777778 | 16.636 |
| 0.7034722222222222 | 16.636 |
| 0.7041666666666666 | 21.024 |
| 0.7048611111111112 | 16.636 |
| 0.7055555555555556 | 21.024 |
| 0.7062499999999999 | 21.024 |
| 0.7069444444444444 | 21.024 |
| 0.7076388888888889 | 16.636 |
| 0.7083333333333334 | 16.636 |
| 0.7090277777777777 | 16.636 |
| 0.7097222222222223 | 16.636 |
| 0.7104166666666667 | 12.257 |
| 0.7111111111111111 | 12.257 |
| 0.7118055555555555 | 12.257 |
| 0.7125 | 12.257 |
| 0.7131944444444445 | 12.257 |
| 0.7138888888888889 | 12.257 |
| 0.7145833333333332 | 12.257 |
| 0.7152777777777778 | 7.887 |
| 0.7159722222222222 | 7.887 |
| 0.7166666666666667 | 7.887 |
| 0.717361111111111 | 7.887 |
| 0.7180555555555556 | 7.887 |
| 0.71875 | 7.887 |
| 0.7194444444444444 | 7.887 |
| 0.720138888888889 | 3.525 |
| 0.7208333333333333 | 3.525 |
| 0.7215277777777778 | 3.525 |
| 0.7222222222222222 | 3.525 |
| 0.7229166666666668 | 3.525 |
| 0.7236111111111111 | 3.525 |
| 0.7243055555555555 | 3.525 |
| 0.725 | 3.525 |
| 0.7256944444444445 | 3.525 |
| 0.7263888888888889 | 3.525 |
| 0.7270833333333333 | 3.525 |
| 0.7277777777777777 | 3.525 |
| 0.7284722222222223 | 3.525 |
| 0.7291666666666666 | 3.525 |
| 0.7298611111111111 | 3.525 |
| 0.7305555555555556 | 3.525 |
| 0.7312500000000001 | 3.525 |
| 0.7319444444444444 | 3.525 |
| 0.7326388888888888 | 3.525 |
| 0.7333333333333334 | 0 |
| 0.7340277777777778 | 0 |
| 0.7347222222222222 | 0 |
| 0.7354166666666666 | 0 |
| 0.7361111111111112 | 0 |
| 0.7368055555555556 | 0 |
| 0.7374999999999999 | 0 |
| 0.7381944444444444 | 0 |
| 0.7388888888888889 | 0 |
| 0.7395833333333334 | 0 |
| 0.7402777777777777 | 0 |
| 0.7409722222222223 | 0 |
| 0.7416666666666667 | 0 |
| 0.7423611111111111 | 0 |
| 0.7430555555555555 | 0 |
| 0.74375 | 0 |
| 0.7444444444444445 | 0 |
| 0.7451388888888889 | 0 |
| 0.7458333333333332 | 0 |
| 0.7465277777777778 | 0 |
| 0.7472222222222222 | 0 |
| 0.7479166666666667 | 0 |
| 0.748611111111111 | 0 |
| 0.7493055555555556 | 0 |
| 0.75 | 0 |
| 0.7506944444444444 | 0 |
| 0.751388888888889 | 0 |
| 0.7520833333333333 | 0 |
| 0.7527777777777778 | 0 |
| 0.7534722222222222 | 0 |
| 0.7541666666666668 | 0 |
| 0.7548611111111111 | 0 |
| 0.7555555555555555 | 0 |
| 0.75625 | 0 |
| 0.7569444444444445 | 0 |
| 0.7576388888888889 | 0 |
| 0.7583333333333333 | 0 |
| 0.7590277777777777 | 0 |
| 0.7597222222222223 | 0 |
| 0.7604166666666666 | 0 |
| 0.7611111111111111 | 0 |
| 0.7618055555555556 | 0 |
| 0.7625000000000001 | 0 |
| 0.7631944444444444 | 0 |
| 0.7638888888888888 | 0 |
| 0.7645833333333334 | 0 |
| 0.7652777777777778 | 0 |
| 0.7659722222222222 | 0 |
| 0.7666666666666666 | 0 |
| 0.7673611111111112 | 0 |
| 0.7680555555555556 | 0 |
| 0.7687499999999999 | 0 |
| 0.7694444444444444 | 0 |
| 0.7701388888888889 | 0 |
| 0.7708333333333334 | 0 |
| 0.7715277777777777 | 0 |
| 0.7722222222222223 | 0 |
| 0.7729166666666667 | 0 |
| 0.7736111111111111 | 0 |
| 0.7743055555555555 | 0 |
| 0.775 | 0 |
| 0.7756944444444445 | 0 |
| 0.7763888888888889 | 0 |
| 0.7770833333333332 | 0 |
| 0.7777777777777778 | 0 |
| 0.7784722222222222 | 0 |
| 0.7791666666666667 | 0 |
| 0.779861111111111 | 0 |
| 0.7805555555555556 | 0 |
| 0.78125 | 0 |
| 0.7819444444444444 | 0 |
| 0.782638888888889 | 0 |
| 0.7833333333333333 | 0 |
| 0.7840277777777778 | 0 |
| 0.7847222222222222 | 0 |
| 0.7854166666666668 | 0 |
| 0.7861111111111111 | 0 |
| 0.7868055555555555 | 0 |
| 0.7875 | 0 |
| 0.7881944444444445 | 0 |
| 0.7888888888888889 | 0 |
| 0.7895833333333333 | 0 |
| 0.7902777777777777 | 0 |
| 0.7909722222222223 | 0 |
| 0.7916666666666666 | 0 |
| 0.7923611111111111 | 0 |
| 0.7930555555555556 | 0 |
| 0.7937500000000001 | 0 |
| 0.7944444444444444 | 0 |
| 0.7951388888888888 | 0 |
| 0.7958333333333334 | 0 |
| 0.7965277777777778 | 0 |
| 0.7972222222222222 | 0 |
| 0.7979166666666666 | 0 |
| 0.7986111111111112 | 0 |
| 0.7993055555555556 | 0 |
| 0.7999999999999999 | 0 |
| 0.8006944444444444 | 0 |
| 0.8013888888888889 | 0 |
| 0.8020833333333334 | 0 |
| 0.8027777777777777 | 0 |
| 0.8034722222222223 | 0 |
| 0.8041666666666667 | 0 |
| 0.8048611111111111 | 0 |
| 0.8055555555555555 | 0 |
| 0.80625 | 0 |
| 0.8069444444444445 | 0 |
| 0.8076388888888889 | 0 |
| 0.8083333333333332 | 0 |
| 0.8090277777777778 | 0 |
| 0.8097222222222222 | 0 |
| 0.8104166666666667 | 0 |
| 0.811111111111111 | 0 |
| 0.8118055555555556 | 0 |
| 0.8125 | 0 |
| 0.8131944444444444 | 0 |
| 0.813888888888889 | 0 |
| 0.8145833333333333 | 0 |
| 0.8152777777777778 | 0 |
| 0.8159722222222222 | 0 |
| 0.8166666666666668 | 0 |
| 0.8173611111111111 | 0 |
| 0.8180555555555555 | 0 |
| 0.81875 | 0 |
| 0.8194444444444445 | 0 |
| 0.8201388888888889 | 0 |
| 0.8208333333333333 | 0 |
| 0.8215277777777777 | 0 |
| 0.8222222222222223 | 0 |
| 0.8229166666666666 | 0 |
| 0.8236111111111111 | 0 |
| 0.8243055555555556 | 0 |
| 0.8250000000000001 | 0 |
| 0.8256944444444444 | 0 |
| 0.8263888888888888 | 0 |
| 0.8270833333333334 | 0 |
| 0.8277777777777778 | 0 |
| 0.8284722222222222 | 0 |
| 0.8291666666666666 | 0 |
| 0.8298611111111112 | 0 |
| 0.8305555555555556 | 0 |
| 0.8312499999999999 | 0 |
| 0.8319444444444444 | 0 |
| 0.8326388888888889 | 0 |
| 0.8333333333333334 | 0 |
| 0.8340277777777777 | 0 |
| 0.8347222222222223 | 0 |
| 0.8354166666666667 | 0 |
| 0.8361111111111111 | 0 |
| 0.8368055555555555 | 0 |
| 0.8375 | 0 |
| 0.8381944444444445 | 0 |
| 0.8388888888888889 | 0 |
| 0.8395833333333332 | 0 |
| 0.8402777777777778 | 0 |
| 0.8409722222222222 | 0 |
| 0.8416666666666667 | 0 |
| 0.842361111111111 | 0 |
| 0.8430555555555556 | 0 |
| 0.84375 | 0 |
| 0.8444444444444444 | 0 |
| 0.845138888888889 | 0 |
| 0.8458333333333333 | 0 |
| 0.8465277777777778 | 0 |
| 0.8472222222222222 | 0 |
| 0.8479166666666668 | 0 |
| 0.8486111111111111 | 0 |
| 0.8493055555555555 | 0 |
| 0.85 | 0 |
| 0.8506944444444445 | 0 |
| 0.8513888888888889 | 0 |
| 0.8520833333333333 | 0 |
| 0.8527777777777777 | 0 |
| 0.8534722222222223 | 0 |
| 0.8541666666666666 | 0 |
| 0.8548611111111111 | 0 |
| 0.8555555555555556 | 0 |
| 0.8562500000000001 | 0 |
| 0.8569444444444444 | 0 |
| 0.8576388888888888 | 0 |
| 0.8583333333333334 | 0 |
| 0.8590277777777778 | 0 |
| 0.8597222222222222 | 0 |
| 0.8604166666666666 | 0 |
| 0.8611111111111112 | 0 |
| 0.8618055555555556 | 0 |
| 0.8624999999999999 | 0 |
| 0.8631944444444444 | 0 |
| 0.8638888888888889 | 0 |
| 0.8645833333333334 | 0 |
| 0.8652777777777777 | 0 |
| 0.8659722222222223 | 0 |
| 0.8666666666666667 | 0 |
| 0.8673611111111111 | 0 |
| 0.8680555555555555 | 0 |
| 0.86875 | 0 |
| 0.8694444444444445 | 0 |
| 0.8701388888888889 | 0 |
| 0.8708333333333332 | 0 |
| 0.8715277777777778 | 0 |
| 0.8722222222222222 | 0 |
| 0.8729166666666667 | 0 |
| 0.873611111111111 | 0 |
| 0.8743055555555556 | 0 |
| 0.875 | 0 |
| 0.8756944444444444 | 0 |
| 0.876388888888889 | 0 |
| 0.8770833333333333 | 0 |
| 0.8777777777777778 | 0 |
| 0.8784722222222222 | 0 |
| 0.8791666666666668 | 0 |
| 0.8798611111111111 | 0 |
| 0.8805555555555555 | 0 |
| 0.88125 | 0 |
| 0.8819444444444445 | 0 |
| 0.8826388888888889 | 0 |
| 0.8833333333333333 | 0 |
| 0.8840277777777777 | 0 |
| 0.8847222222222223 | 0 |
| 0.8854166666666666 | 0 |
| 0.8861111111111111 | 0 |
| 0.8868055555555556 | 0 |
| 0.8875000000000001 | 0 |
| 0.8881944444444444 | 0 |
| 0.8888888888888888 | 0 |
| 0.8895833333333334 | 0 |
| 0.8902777777777778 | 0 |
| 0.8909722222222222 | 0 |
| 0.8916666666666666 | 0 |
| 0.8923611111111112 | 0 |
| 0.8930555555555556 | 0 |
| 0.8937499999999999 | 0 |
| 0.8944444444444444 | 0 |
| 0.8951388888888889 | 0 |
| 0.8958333333333334 | 0 |
| 0.8965277777777777 | 0 |
| 0.8972222222222223 | 0 |
| 0.8979166666666667 | 0 |
| 0.8986111111111111 | 0 |
| 0.8993055555555555 | 0 |
| 0.9 | 0 |
| 0.9006944444444445 | 0 |
| 0.9013888888888889 | 0 |
| 0.9020833333333332 | 0 |
| 0.9027777777777778 | 0 |
| 0.9034722222222222 | 0 |
| 0.9041666666666667 | 0 |
| 0.904861111111111 | 0 |
| 0.9055555555555556 | 0 |
| 0.90625 | 0 |
| 0.9069444444444444 | 0 |
| 0.907638888888889 | 0 |
| 0.9083333333333333 | 0 |
| 0.9090277777777778 | 0 |
| 0.9097222222222222 | 0 |
| 0.9104166666666668 | 0 |
| 0.9111111111111111 | 0 |
| 0.9118055555555555 | 0 |
| 0.9125 | 0 |
| 0.9131944444444445 | 0 |
| 0.9138888888888889 | 0 |
| 0.9145833333333333 | 0 |
| 0.9152777777777777 | 0 |
| 0.9159722222222223 | 0 |
| 0.9166666666666666 | 0 |
| 0.9173611111111111 | 0 |
| 0.9180555555555556 | 0 |
| 0.9187500000000001 | 0 |
| 0.9194444444444444 | 0 |
| 0.9201388888888888 | 0 |
| 0.9208333333333334 | 0 |
| 0.9215277777777778 | 0 |
| 0.9222222222222222 | 0 |
| 0.9229166666666666 | 0 |
| 0.9236111111111112 | 0 |
| 0.9243055555555556 | 0 |
| 0.9249999999999999 | 0 |
| 0.9256944444444444 | 0 |
| 0.9263888888888889 | 0 |
| 0.9270833333333334 | 0 |
| 0.9277777777777777 | 0 |
| 0.9284722222222223 | 0 |
| 0.9291666666666667 | 0 |
| 0.9298611111111111 | 0 |
| 0.9305555555555555 | 0 |
| 0.93125 | 0 |
| 0.9319444444444445 | 0 |
| 0.9326388888888889 | 0 |
| 0.9333333333333332 | 0 |
| 0.9340277777777778 | 0 |
| 0.9347222222222222 | 0 |
| 0.9354166666666667 | 0 |
| 0.936111111111111 | 0 |
| 0.9368055555555556 | 0 |
| 0.9375 | 0 |
| 0.9381944444444444 | 0 |
| 0.938888888888889 | 0 |
| 0.9395833333333333 | 0 |
| 0.9402777777777778 | 0 |
| 0.9409722222222222 | 0 |
| 0.9416666666666668 | 0 |
| 0.9423611111111111 | 0 |
| 0.9430555555555555 | 0 |
| 0.94375 | 0 |
| 0.9444444444444445 | 0 |
| 0.9451388888888889 | 0 |
| 0.9458333333333333 | 0 |
| 0.9465277777777777 | 0 |
| 0.9472222222222223 | 0 |
| 0.9479166666666666 | 0 |
| 0.9486111111111111 | 0 |
| 0.9493055555555556 | 0 |
| 0.9500000000000001 | 0 |
| 0.9506944444444444 | 0 |
| 0.9513888888888888 | 0 |
| 0.9520833333333334 | 0 |
| 0.9527777777777778 | 0 |
| 0.9534722222222222 | 0 |
| 0.9541666666666666 | 0 |
| 0.9548611111111112 | 0 |
| 0.9555555555555556 | 0 |
| 0.9562499999999999 | 0 |
| 0.9569444444444444 | 0 |
| 0.9576388888888889 | 0 |
| 0.9583333333333334 | 0 |
| 0.9590277777777777 | 0 |
| 0.9597222222222223 | 0 |
| 0.9604166666666667 | 0 |
| 0.9611111111111111 | 0 |
| 0.9618055555555555 | 0 |
| 0.9625 | 0 |
| 0.9631944444444445 | 0 |
| 0.9638888888888889 | 0 |
| 0.9645833333333332 | 0 |
| 0.9652777777777778 | 0 |
| 0.9659722222222222 | 0 |
| 0.9666666666666667 | 0 |
| 0.967361111111111 | 0 |
| 0.9680555555555556 | 0 |
| 0.96875 | 0 |
| 0.9694444444444444 | 0 |
| 0.970138888888889 | 0 |
| 0.9708333333333333 | 0 |
| 0.9715277777777778 | 0 |
| 0.9722222222222222 | 0 |
| 0.9729166666666668 | 0 |
| 0.9736111111111111 | 0 |
| 0.9743055555555555 | 0 |
| 0.975 | 0 |
| 0.9756944444444445 | 0 |
| 0.9763888888888889 | 0 |
| 0.9770833333333333 | 0 |
| 0.9777777777777777 | 0 |
| 0.9784722222222223 | 0 |
| 0.9791666666666666 | 0 |
| 0.9798611111111111 | 0 |
| 0.9805555555555556 | 0 |
| 0.9812500000000001 | 0 |
| 0.9819444444444444 | 0 |
| 0.9826388888888888 | 0 |
| 0.9833333333333334 | 0 |
| 0.9840277777777778 | 0 |
| 0.9847222222222222 | 0 |
| 0.9854166666666666 | 0 |
| 0.9861111111111112 | 0 |
| 0.9868055555555556 | 0 |
| 0.9874999999999999 | 0 |
| 0.9881944444444444 | 0 |
| 0.9888888888888889 | 0 |
| 0.9895833333333334 | 0 |
| 0.9902777777777777 | 0 |
| 0.9909722222222223 | 0 |
| 0.9916666666666667 | 0 |
| 0.9923611111111111 | 0 |
| 0.9930555555555555 | 0 |
| 0.99375 | 0 |
| 0.9944444444444445 | 0 |
| 0.9951388888888889 | 0 |
| 0.9958333333333332 | 0 |
| 0.9965277777777778 | 0 |
| 0.9972222222222222 | 0 |
| 0.9979166666666667 | 0 |
| 0.998611111111111 | 0 |
| 0.9993055555555556 | 0 |